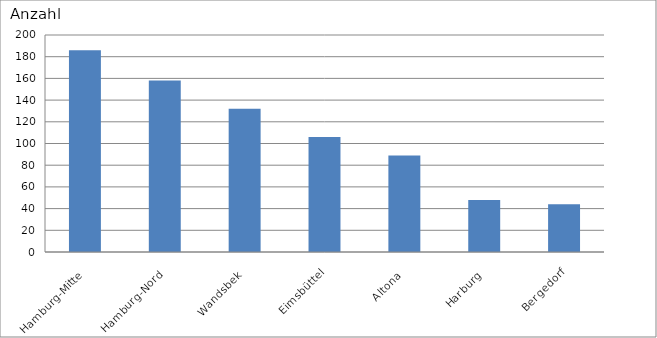
| Category | Hamburg-Mitte Hamburg-Nord Wandsbek Eimsbüttel Altona Harburg Bergedorf |
|---|---|
| Hamburg-Mitte | 186 |
| Hamburg-Nord | 158 |
| Wandsbek | 132 |
| Eimsbüttel | 106 |
| Altona | 89 |
| Harburg | 48 |
| Bergedorf | 44 |